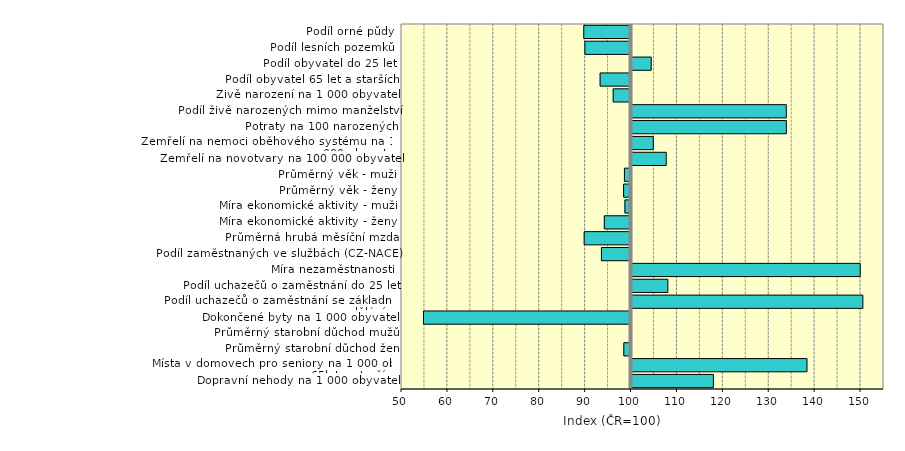
| Category | Series 0 |
|---|---|
| Dopravní nehody na 1 000 obyvatel | 117.831 |
| Místa v domovech pro seniory na 1 000 obyv 65let a starších | 138.229 |
| Průměrný starobní důchod žen | 98.43 |
| Průměrný starobní důchod mužů | 99.882 |
| Dokončené byty na 1 000 obyvatel | 54.791 |
| Podíl uchazečů o zaměstnání se základním vzděláním | 150.397 |
| Podíl uchazečů o zaměstnání do 25 let | 107.912 |
| Míra nezaměstnanosti | 149.815 |
| Podíl zaměstnaných ve službách (CZ-NACE) | 93.555 |
| Průměrná hrubá měsíční mzda | 89.798 |
| Míra ekonomické aktivity - ženy | 94.19 |
| Míra ekonomické aktivity - muži | 98.667 |
| Průměrný věk - ženy | 98.384 |
| Průměrný věk - muži | 98.563 |
| Zemřelí na novotvary na 100 000 obyvatel | 107.559 |
| Zemřelí na nemoci oběhového systému na 100 000 obyvatel | 104.744 |
| Potraty na 100 narozených | 133.731 |
| Podíl živě narozených mimo manželství | 133.717 |
| Živě narození na 1 000 obyvatel | 96.111 |
| Podíl obyvatel 65 let a starších | 93.268 |
| Podíl obyvatel do 25 let | 104.291 |
| Podíl lesních pozemků | 89.952 |
| Podíl orné půdy | 89.71 |